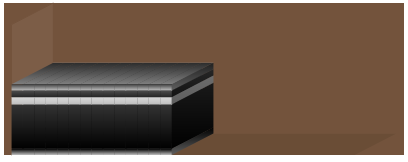
| Category | Profiel onder | bodem | Profiel midden | Deksel | Profiel top |
|---|---|---|---|---|---|
| 0 | 0.047 | 0.34 | 0.056 | 0.051 | 0.047 |
| 1 | 0.047 | 0.34 | 0.056 | 0.051 | 0.047 |
| 2 | 0.047 | 0.34 | 0.056 | 0.051 | 0.047 |
| 3 | 0.047 | 0.34 | 0.056 | 0.051 | 0.047 |
| 4 | 0.047 | 0.34 | 0.056 | 0.051 | 0.047 |
| 5 | 0.047 | 0.34 | 0.056 | 0.051 | 0.047 |
| 6 | 0.047 | 0.34 | 0.056 | 0.051 | 0.047 |
| 7 | 0.047 | 0.34 | 0.056 | 0.051 | 0.047 |
| 8 | 0.047 | 0.34 | 0.056 | 0.051 | 0.047 |
| 9 | 0.047 | 0.34 | 0.056 | 0.051 | 0.047 |
| 10 | 0.047 | 0.34 | 0.056 | 0.051 | 0.047 |
| 11 | 0.047 | 0.34 | 0.056 | 0.051 | 0.047 |
| 12 | 0.047 | 0.34 | 0.056 | 0.051 | 0.047 |
| 13 | 0.047 | 0.34 | 0.056 | 0.051 | 0.047 |
| 14 | -0.1 | -0.1 | -0.1 | -0.1 | -0.1 |
| 15 | -0.1 | -0.1 | -0.1 | -0.1 | -0.1 |
| 16 | -0.1 | -0.1 | -0.1 | -0.1 | -0.1 |
| 17 | -0.1 | -0.1 | -0.1 | -0.1 | -0.1 |
| 18 | -0.1 | -0.1 | -0.1 | -0.1 | -0.1 |
| 19 | -0.1 | -0.1 | -0.1 | -0.1 | -0.1 |
| 20 | -0.1 | -0.1 | -0.1 | -0.1 | -0.1 |
| 21 | -0.1 | -0.1 | -0.1 | -0.1 | -0.1 |
| 22 | -0.1 | -0.1 | -0.1 | -0.1 | -0.1 |
| 23 | -0.1 | -0.1 | -0.1 | -0.1 | -0.1 |
| 24 | -0.1 | -0.1 | -0.1 | -0.1 | -0.1 |
| 25 | -0.1 | -0.1 | -0.1 | -0.1 | -0.1 |
| 26 | -0.1 | -0.1 | -0.1 | -0.1 | -0.1 |
| 27 | -0.1 | -0.1 | -0.1 | -0.1 | -0.1 |
| 28 | -0.1 | -0.1 | -0.1 | -0.1 | -0.1 |
| 29 | -0.1 | -0.1 | -0.1 | -0.1 | -0.1 |